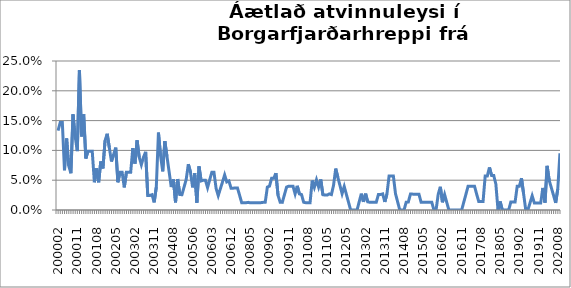
| Category | Series 0 |
|---|---|
| 200002 | 0.133 |
| 200003 | 0.147 |
| 200004 | 0.147 |
| 200005 | 0.067 |
| 200006 | 0.12 |
| 200007 | 0.074 |
| 200008 | 0.062 |
| 200009 | 0.16 |
| 200010 | 0.123 |
| 200011 | 0.099 |
| 200012 | 0.235 |
| 200101 | 0.123 |
| 200102 | 0.16 |
| 200103 | 0.086 |
| 200104 | 0.099 |
| 200105 | 0.099 |
| 200106 | 0.099 |
| 200107 | 0.047 |
| 200108 | 0.07 |
| 200109 | 0.047 |
| 200110 | 0.081 |
| 200111 | 0.07 |
| 200112 | 0.116 |
| 200201 | 0.128 |
| 200202 | 0.105 |
| 200203 | 0.081 |
| 200204 | 0.093 |
| 200205 | 0.105 |
| 200206 | 0.047 |
| 200207 | 0.063 |
| 200208 | 0.063 |
| 200209 | 0.038 |
| 200210 | 0.063 |
| 200211 | 0.063 |
| 200212 | 0.063 |
| 200301 | 0.104 |
| 200302 | 0.078 |
| 200303 | 0.117 |
| 200304 | 0.089 |
| 200305 | 0.076 |
| 200306 | 0.089 |
| 200307 | 0.098 |
| 200308 | 0.024 |
| 200309 | 0.024 |
| 200310 | 0.026 |
| 200311 | 0.013 |
| 200312 | 0.038 |
| 200401 | 0.13 |
| 200402 | 0.091 |
| 200403 | 0.065 |
| 200404 | 0.115 |
| 200405 | 0.09 |
| 200406 | 0.064 |
| 200407 | 0.038 |
| 200408 | 0.051 |
| 200409 | 0.013 |
| 200410 | 0.052 |
| 200412 | 0.026 |
| 200501 | 0.026 |
| 200502 | 0.038 |
| 200503 | 0.051 |
| 200504 | 0.077 |
| 200505 | 0.063 |
| 200506 | 0.038 |
| 200507 | 0.062 |
| 200508 | 0.012 |
| 200509 | 0.073 |
| 200510 | 0.049 |
| 200511 | 0.05 |
| 200512 | 0.05 |
| 200601 | 0.038 |
| 200602 | 0.051 |
| 200603 | 0.063 |
| 200604 | 0.063 |
| 200605 | 0.036 |
| 200606 | 0.024 |
| 200607 | 0.036 |
| 200608 | 0.047 |
| 200609 | 0.059 |
| 200610 | 0.047 |
| 200611 | 0.049 |
| 200612 | 0.037 |
| 200701 | 0.037 |
| 200702 | 0.037 |
| 200703 | 0.037 |
| 200704 | 0.025 |
| 200705 | 0.012 |
| 200709 | 0.012 |
| 200710 | 0.012 |
| 200804 | 0.013 |
| 200805 | 0.012 |
| 200806 | 0.012 |
| 200807 | 0.012 |
| 200808 | 0.012 |
| 200809 | 0.012 |
| 200810 | 0.012 |
| 200811 | 0.013 |
| 200812 | 0.013 |
| 200901 | 0.038 |
| 200902 | 0.04 |
| 200903 | 0.053 |
| 200904 | 0.053 |
| 200905 | 0.062 |
| 200906 | 0.025 |
| 200907 | 0.013 |
| 200908 | 0.013 |
| 200909 | 0.026 |
| 200910 | 0.038 |
| 200911 | 0.04 |
| 200912 | 0.04 |
| 201001 | 0.04 |
| 201002 | 0.027 |
| 201003 | 0.041 |
| 201004 | 0.027 |
| 201005 | 0.026 |
| 201006 | 0.013 |
| 201007 | 0.012 |
| 201008 | 0.012 |
| 201009 | 0.012 |
| 201010 | 0.049 |
| 201011 | 0.038 |
| 201012 | 0.051 |
| 201101 | 0.038 |
| 201102 | 0.051 |
| 201103 | 0.026 |
| 201104 | 0.025 |
| 201105 | 0.025 |
| 201109 | 0.027 |
| 201110 | 0.026 |
| 201111 | 0.042 |
| 201112 | 0.069 |
| 201201 | 0.055 |
| 201202 | 0.041 |
| 201203 | 0.027 |
| 201204 | 0.039 |
| 201205 | 0.026 |
| 201206 | 0.013 |
| 201207 | 0 |
| 201208 | 0 |
| 201209 | 0 |
| 201210 | 0 |
| 201211 | 0.014 |
| 201212 | 0.027 |
| 201301 | 0.014 |
| 201302 | 0.027 |
| 201303 | 0.014 |
| 201304 | 0.013 |
| 201305 | 0.013 |
| 201306 | 0.013 |
| 201307 | 0.013 |
| 201308 | 0.026 |
| 201309 | 0.026 |
| 201310 | 0.027 |
| 201311 | 0.014 |
| 201312 | 0.027 |
| 201401 | 0.057 |
| 201402 | 0.057 |
| 201403 | 0.057 |
| 201404 | 0.027 |
| 201405 | 0.014 |
| 201406 | 0 |
| 201407 | 0 |
| 201408 | 0 |
| 201409 | 0.013 |
| 201410 | 0.013 |
| 201411 | 0.027 |
| 201412 | 0.027 |
| 201501 | 0.026 |
| 201502 | 0.026 |
| 201503 | 0.026 |
| 201504 | 0.013 |
| 201505 | 0.013 |
| 201506 | 0.013 |
| 201507 | 0.013 |
| 201508 | 0.013 |
| 201509 | 0.013 |
| 201510 | 0 |
| 201511 | 0 |
| 201512 | 0.026 |
| 201601 | 0.039 |
| 201602 | 0.013 |
| 201603 | 0.026 |
| 201604 | 0.013 |
| 201605 | 0 |
| 201606 | 0 |
| 201607 | 0 |
| 201608 | 0 |
| 201609 | 0 |
| 201610 | 0 |
| 201611 | 0 |
| 201612 | 0.014 |
| 201701 | 0.027 |
| 201702 | 0.04 |
| 201703 | 0.04 |
| 201704 | 0.04 |
| 201705 | 0.04 |
| 201706 | 0.027 |
| 201707 | 0.014 |
| 201708 | 0.014 |
| 201709 | 0.014 |
| 201710 | 0.057 |
| 201711 | 0.057 |
| 201712 | 0.071 |
| 201801 | 0.058 |
| 201802 | 0.058 |
| 201803 | 0.043 |
| 201804 | 0 |
| 201805 | 0.014 |
| 201806 | 0 |
| 201807 | 0 |
| 201808 | 0 |
| 201809 | 0 |
| 201810 | 0.013 |
| 201811 | 0.013 |
| 201812 | 0.013 |
| 201901 | 0.04 |
| 201902 | 0.04 |
| 201903 | 0.053 |
| 201904 | 0.027 |
| 201905 | 0 |
| 201906 | 0 |
| 201907 | 0.012 |
| 201908 | 0.024 |
| 201909 | 0.012 |
| 201910 | 0.012 |
| 201911 | 0.012 |
| 201912 | 0.012 |
| 202001 | 0.037 |
| 202002 | 0.012 |
| 202003*** | 0.074 |
| 202004 | 0.049 |
| 202005 | 0.037 |
| 202006 | 0.025 |
| 202007 | 0.012 |
| 202008 | 0.036 |
| 202009 | 0.095 |